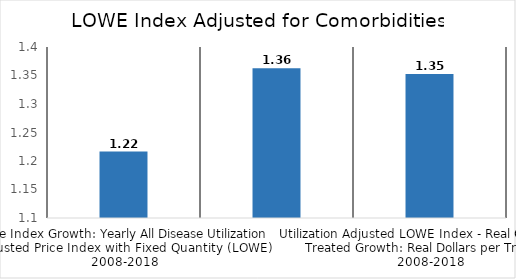
| Category | All Disease |
|---|---|
| Price Index Growth: Yearly All Disease Utilization Adjusted Price Index with Fixed Quantity (LOWE) 2008-2018 | 1.217 |
| Real Utilization Adjusted LOWE Growth in 2008 dollars: Nominal Expenditure Growth / LOWE Index Growth | 1.363 |
| Utilization Adjusted LOWE Index - Real Output Per Treated Growth: Real Dollars per Treated 2008-2018 | 1.352 |